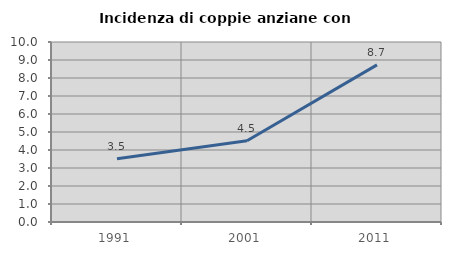
| Category | Incidenza di coppie anziane con figli |
|---|---|
| 1991.0 | 3.518 |
| 2001.0 | 4.516 |
| 2011.0 | 8.73 |